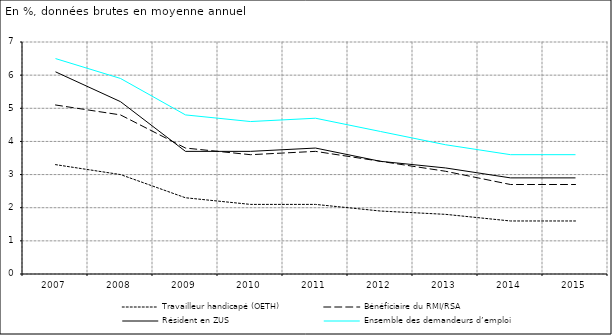
| Category | Travailleur handicapé (OETH) | Bénéficiaire du RMI/RSA | Résident en ZUS | Ensemble des demandeurs d’emploi |
|---|---|---|---|---|
| 2007 | 3.3 | 5.1 | 6.1 | 6.5 |
| 2008 | 3 | 4.8 | 5.2 | 5.9 |
| 2009 | 2.3 | 3.8 | 3.7 | 4.8 |
| 2010 | 2.1 | 3.6 | 3.7 | 4.6 |
| 2011 | 2.1 | 3.7 | 3.8 | 4.7 |
| 2012 | 1.9 | 3.4 | 3.4 | 4.3 |
| 2013 | 1.8 | 3.1 | 3.2 | 3.9 |
| 2014 | 1.6 | 2.7 | 2.9 | 3.6 |
| 2015 | 1.6 | 2.7 | 2.9 | 3.6 |